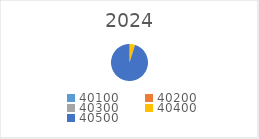
| Category | Series 0 |
|---|---|
| 40100.0 | 0 |
| 40200.0 | 0 |
| 40300.0 | 0 |
| 40400.0 | 20000 |
| 40500.0 | 390000 |